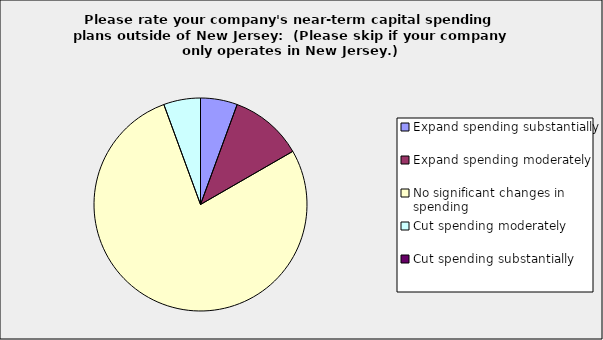
| Category | Series 0 |
|---|---|
| Expand spending substantially | 0.056 |
| Expand spending moderately | 0.111 |
| No significant changes in spending | 0.778 |
| Cut spending moderately | 0.056 |
| Cut spending substantially | 0 |